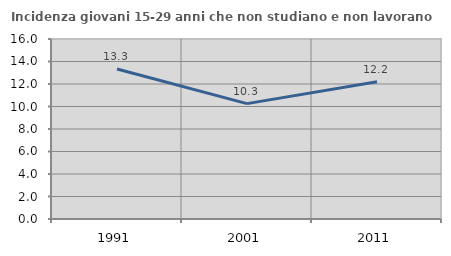
| Category | Incidenza giovani 15-29 anni che non studiano e non lavorano  |
|---|---|
| 1991.0 | 13.333 |
| 2001.0 | 10.256 |
| 2011.0 | 12.195 |